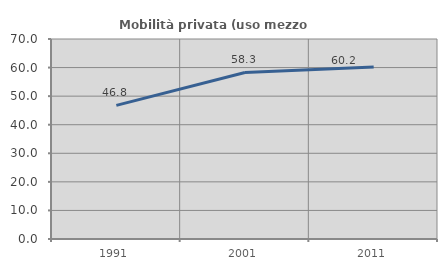
| Category | Mobilità privata (uso mezzo privato) |
|---|---|
| 1991.0 | 46.771 |
| 2001.0 | 58.287 |
| 2011.0 | 60.197 |